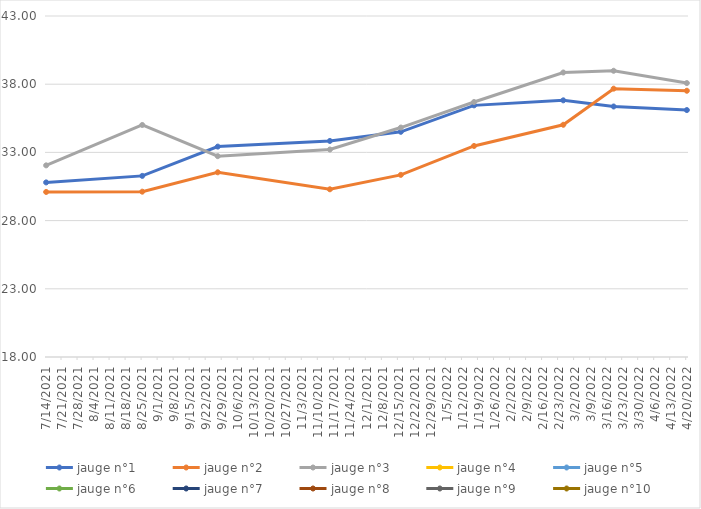
| Category | jauge n°1 | jauge n°2 | jauge n°3 | jauge n°4 | jauge n°5 | jauge n°6 | jauge n°7 | jauge n°8 | jauge n°9 | jauge n°10 |
|---|---|---|---|---|---|---|---|---|---|---|
| 7/14/21 | 30.8 | 30.1 | 32.05 | 0 | 0 | 0 | 0 | 0 | 0 | 0 |
| 8/25/21 | 31.278 | 30.121 | 35.01 | 0 | 0 | 0 | 0 | 0 | 0 | 0 |
| 9/27/21 | 33.425 | 31.542 | 32.723 | 0 | 0 | 0 | 0 | 0 | 0 | 0 |
| 11/15/21 | 33.84 | 30.296 | 33.212 | 0 | 0 | 0 | 0 | 0 | 0 | 0 |
| 12/16/21 | 34.511 | 31.353 | 34.822 | 0 | 0 | 0 | 0 | 0 | 0 | 0 |
| 1/17/22 | 36.448 | 33.472 | 36.692 | 0 | 0 | 0 | 0 | 0 | 0 | 0 |
| 2/25/22 | 36.817 | 35.026 | 38.858 | 0 | 0 | 0 | 0 | 0 | 0 | 0 |
| 3/19/22 | 36.366 | 37.673 | 38.984 | 0 | 0 | 0 | 0 | 0 | 0 | 0 |
| 4/20/22 | 36.104 | 37.52 | 38.082 | 0 | 0 | 0 | 0 | 0 | 0 | 0 |